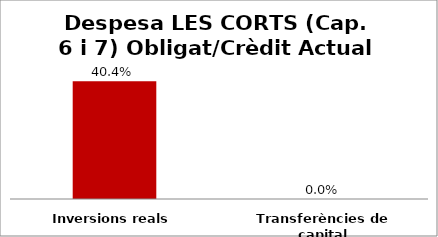
| Category | Series 0 |
|---|---|
| Inversions reals | 0.404 |
| Transferències de capital | 0 |